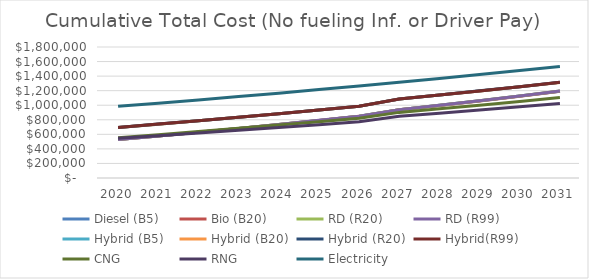
| Category | Diesel (B5) | Bio (B20) | RD (R20) | RD (R99) | Hybrid (B5) | Hybrid (B20) | Hybrid (R20) | Hybrid(R99) | CNG | RNG | Electricity |
|---|---|---|---|---|---|---|---|---|---|---|---|
| 2020.0 | 527973.104 | 527846.194 | 528191.168 | 528319.423 | 695198.206 | 695088.884 | 695360.918 | 695414.307 | 553618.507 | 546855.222 | 984966.119 |
| 2021.0 | 577350.402 | 577088.319 | 577770.894 | 578004.395 | 740074.154 | 739848.31 | 740385.178 | 740470.357 | 595479.462 | 581952.892 | 1028364.468 |
| 2022.0 | 628347.396 | 627941.677 | 628954.304 | 629269.49 | 786408.356 | 786058.617 | 786852.946 | 786947.797 | 638180.506 | 617890.651 | 1072967.091 |
| 2023.0 | 680781.274 | 680223.256 | 681558.203 | 681930.948 | 834041.367 | 833560.184 | 834604.424 | 834686.297 | 682012.216 | 654959.076 | 1118856.636 |
| 2024.0 | 734936.959 | 734217.769 | 735867.119 | 736272.718 | 883224.021 | 882603.662 | 883890.083 | 883935.786 | 726822.987 | 693006.562 | 1166027.11 |
| 2025.0 | 790581.901 | 789692.453 | 791648.101 | 792061.254 | 933753.292 | 932985.841 | 934506.525 | 934492.308 | 772790.169 | 732210.459 | 1214621.958 |
| 2026.0 | 848075.519 | 847006.51 | 849260.155 | 849654.957 | 985945.4 | 985022.751 | 986769.593 | 986671.136 | 819886.784 | 772543.789 | 1264635.687 |
| 2027.0 | 937589.417 | 936331.32 | 938874.46 | 939224.384 | 1085813.295 | 1084727.146 | 1086691.844 | 1086484.245 | 901601.094 | 847494.813 | 1315960.432 |
| 2028.0 | 998499.623 | 997042.682 | 999866.615 | 1000144.496 | 1140271.789 | 1139022.141 | 1141204.696 | 1140887.954 | 950755.02 | 889885.455 | 1368484.867 |
| 2029.0 | 1061200.348 | 1059534.574 | 1062630.385 | 1062808.408 | 1196325.573 | 1194903.925 | 1197295.836 | 1196844.45 | 1000826.221 | 933193.37 | 1422196.261 |
| 2030.0 | 1126051.715 | 1124166.878 | 1127525.441 | 1127575.122 | 1254291.113 | 1252688.761 | 1255281.323 | 1254669.182 | 1052740.127 | 978343.992 | 1477101.774 |
| 2031.0 | 1192826.924 | 1190712.55 | 1194324.519 | 1194216.691 | 1313970.088 | 1312178.118 | 1314962.42 | 1314162.782 | 1105596.238 | 1024436.817 | 1533262.512 |